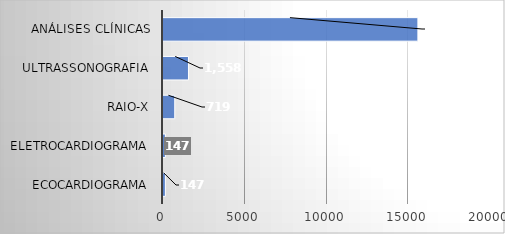
| Category | Series 0 |
|---|---|
| ECOCARDIOGRAMA | 147 |
| ELETROCARDIOGRAMA | 147 |
| RAIO-X | 719 |
| ULTRASSONOGRAFIA | 1558 |
| ANÁLISES CLÍNICAS | 15590 |